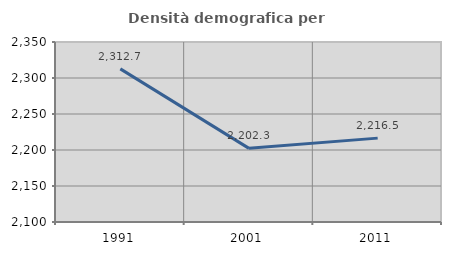
| Category | Densità demografica |
|---|---|
| 1991.0 | 2312.655 |
| 2001.0 | 2202.288 |
| 2011.0 | 2216.499 |